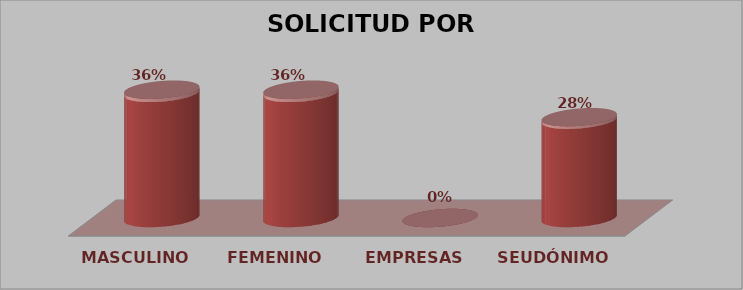
| Category | SOLICITUD POR GÉNERO | Series 1 |
|---|---|---|
| MASCULINO | 14 | 0.359 |
| FEMENINO | 14 | 0.359 |
| EMPRESAS | 0 | 0 |
| SEUDÓNIMO | 11 | 0.282 |